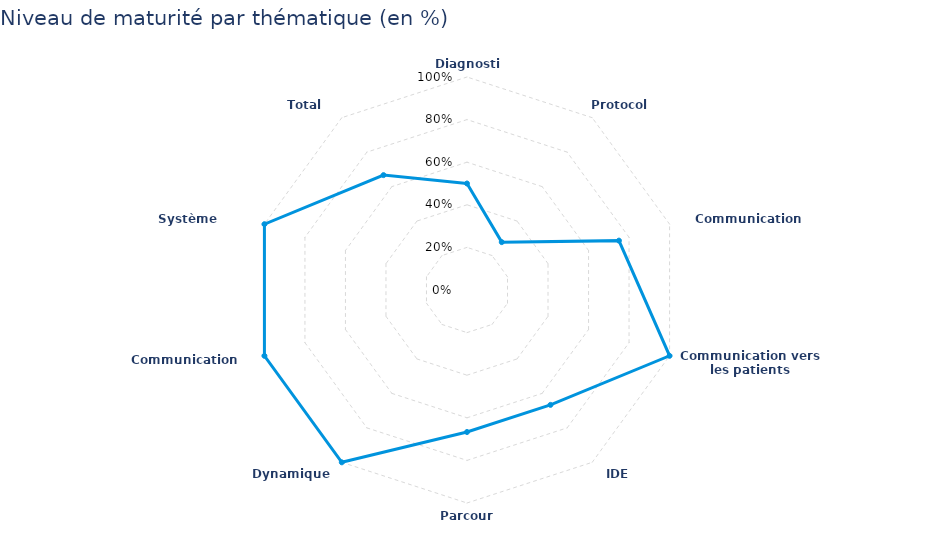
| Category | Niveau de maturité par catégories en % |
|---|---|
| Diagnostic | 0.5 |
| Protocole | 0.278 |
| Communication interne | 0.75 |
| Communication vers les patients | 1 |
| IDE RAC | 0.667 |
| Parcours | 0.667 |
| Dynamique interne | 1 |
| Communication externe | 1 |
| Système d'information | 1 |
| Total général | 0.667 |